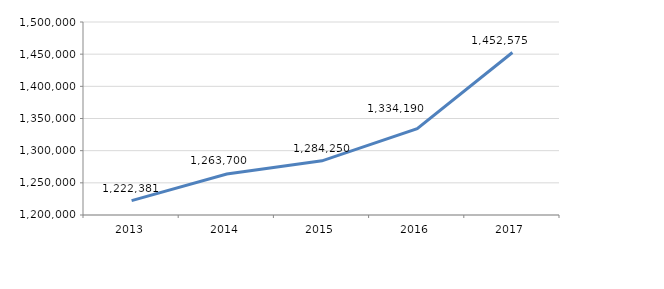
| Category | Series 0 |
|---|---|
| 2013.0 | 1222380.71 |
| 2014.0 | 1263700 |
| 2015.0 | 1284250 |
| 2016.0 | 1334190 |
| 2017.0 | 1452575 |